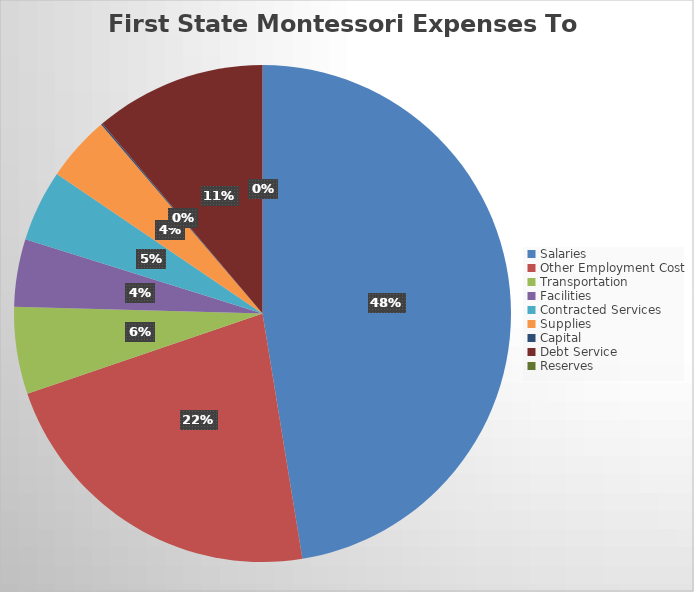
| Category | Series 0 |
|---|---|
| Salaries | 3250591.92 |
| Other Employment Cost | 1530038.88 |
| Transportation | 388655.83 |
| Facilities | 301360.63 |
| Contracted Services | 319288.8 |
| Supplies | 292101.8 |
| Capital | 6645.6 |
| Debt Service | 764340.32 |
| Reserves | 0 |